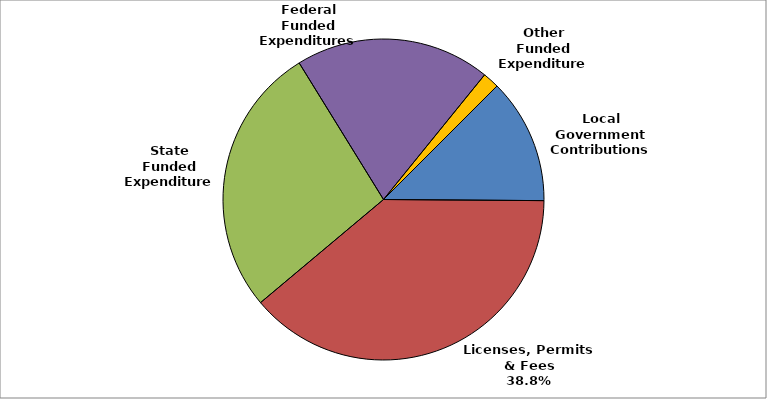
| Category | Series 0 |
|---|---|
| Local Government Contributions | 0.126 |
| Licenses, Permits & Fees | 0.388 |
| State Funded Expenditures | 0.273 |
| Federal Funded Expenditures | 0.196 |
| Other Funded Expenditures | 0.017 |